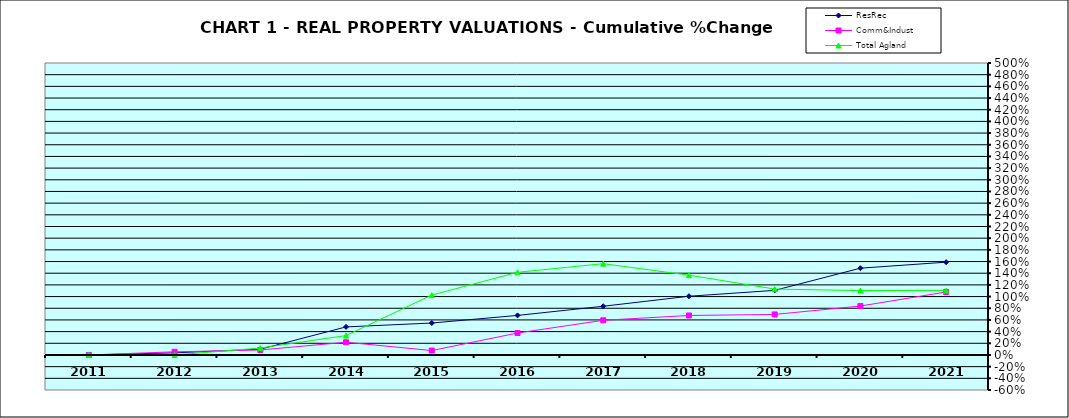
| Category | ResRec | Comm&Indust | Total Agland |
|---|---|---|---|
| 2011.0 | 0 | 0 | 0 |
| 2012.0 | 0.036 | 0.054 | 0 |
| 2013.0 | 0.099 | 0.085 | 0.119 |
| 2014.0 | 0.48 | 0.218 | 0.332 |
| 2015.0 | 0.547 | 0.075 | 1.025 |
| 2016.0 | 0.677 | 0.376 | 1.416 |
| 2017.0 | 0.834 | 0.594 | 1.563 |
| 2018.0 | 1.006 | 0.676 | 1.367 |
| 2019.0 | 1.106 | 0.694 | 1.128 |
| 2020.0 | 1.486 | 0.838 | 1.103 |
| 2021.0 | 1.589 | 1.078 | 1.102 |